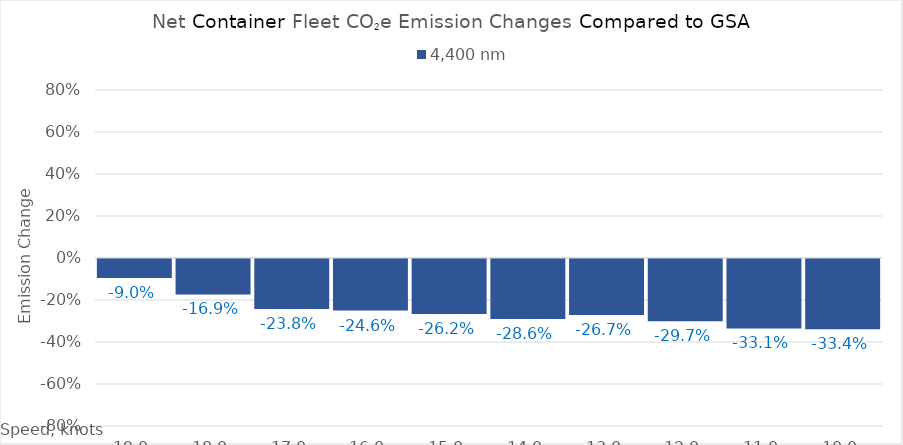
| Category | 4,400 |
|---|---|
| 19.0 | -0.09 |
| 18.0 | -0.169 |
| 17.0 | -0.238 |
| 16.0 | -0.246 |
| 15.0 | -0.262 |
| 14.0 | -0.286 |
| 13.0 | -0.267 |
| 12.0 | -0.297 |
| 11.0 | -0.331 |
| 10.0 | -0.334 |